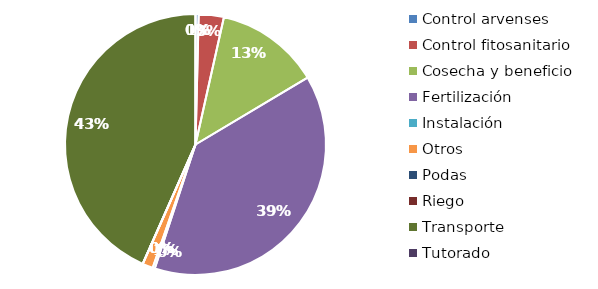
| Category | Valor |
|---|---|
| Control arvenses | 221316 |
| Control fitosanitario | 1770226 |
| Cosecha y beneficio | 7365241.189 |
| Fertilización | 21994020 |
| Instalación | 154917.934 |
| Otros | 743596 |
| Podas | 0 |
| Riego | 0 |
| Transporte | 24701915 |
| Tutorado | 0 |